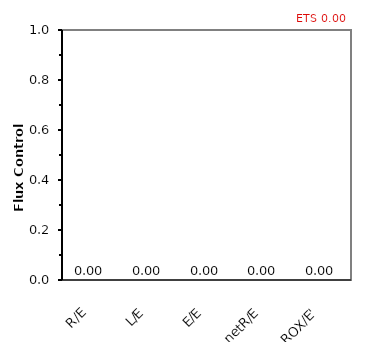
| Category | ETS 0,00 |
|---|---|
| R/E | 0 |
| L/E | 0 |
| E/E | 0 |
| netR/E | 0 |
| ROX/E' | 0 |